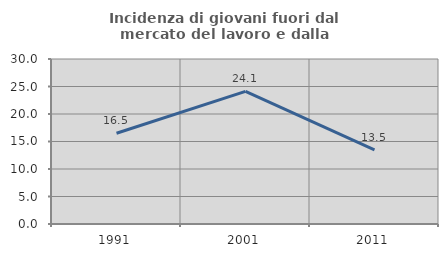
| Category | Incidenza di giovani fuori dal mercato del lavoro e dalla formazione  |
|---|---|
| 1991.0 | 16.509 |
| 2001.0 | 24.116 |
| 2011.0 | 13.456 |